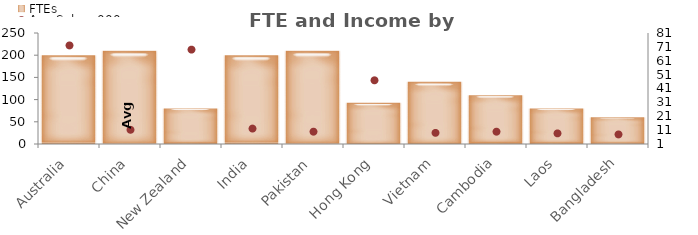
| Category | FTEs |
|---|---|
| Australia | 200 |
| China | 210 |
| New Zealand | 80 |
| India | 200 |
| Pakistan | 210 |
| Hong Kong | 93 |
| Vietnam | 140 |
| Cambodia | 110 |
| Laos | 80 |
| Bangladesh | 60 |